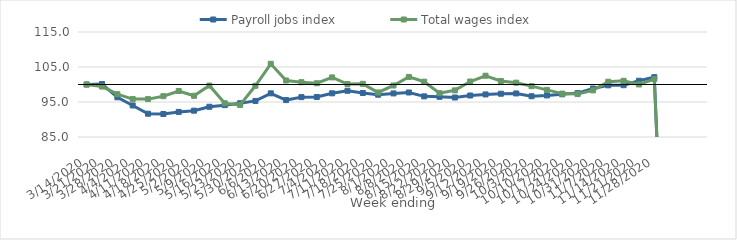
| Category | Payroll jobs index | Total wages index |
|---|---|---|
| 14/03/2020 | 100 | 100 |
| 21/03/2020 | 100.123 | 99.417 |
| 28/03/2020 | 96.353 | 97.228 |
| 04/04/2020 | 94.002 | 95.837 |
| 11/04/2020 | 91.65 | 95.827 |
| 18/04/2020 | 91.573 | 96.664 |
| 25/04/2020 | 92.173 | 98.136 |
| 02/05/2020 | 92.52 | 96.774 |
| 09/05/2020 | 93.637 | 99.694 |
| 16/05/2020 | 94.101 | 94.635 |
| 23/05/2020 | 94.646 | 94.145 |
| 30/05/2020 | 95.308 | 99.636 |
| 06/06/2020 | 97.476 | 105.919 |
| 13/06/2020 | 95.548 | 101.149 |
| 20/06/2020 | 96.392 | 100.658 |
| 27/06/2020 | 96.435 | 100.35 |
| 04/07/2020 | 97.485 | 102.027 |
| 11/07/2020 | 98.206 | 100.123 |
| 18/07/2020 | 97.569 | 100.193 |
| 25/07/2020 | 97.079 | 97.728 |
| 01/08/2020 | 97.447 | 99.72 |
| 08/08/2020 | 97.718 | 102.164 |
| 15/08/2020 | 96.611 | 100.8 |
| 22/08/2020 | 96.483 | 97.528 |
| 29/08/2020 | 96.285 | 98.329 |
| 05/09/2020 | 96.852 | 100.85 |
| 12/09/2020 | 97.164 | 102.508 |
| 19/09/2020 | 97.364 | 100.999 |
| 26/09/2020 | 97.442 | 100.516 |
| 03/10/2020 | 96.647 | 99.529 |
| 10/10/2020 | 96.877 | 98.462 |
| 17/10/2020 | 97.205 | 97.396 |
| 24/10/2020 | 97.538 | 97.26 |
| 31/10/2020 | 98.85 | 98.32 |
| 07/11/2020 | 99.765 | 100.792 |
| 14/11/2020 | 99.8 | 101.045 |
| 21/11/2020 | 101.08 | 100.012 |
| 28/11/2020 | 102.097 | 101.522 |